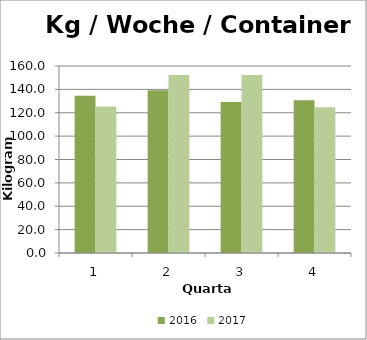
| Category | 2016 | 2017 |
|---|---|---|
| 0 | 134.615 | 125.385 |
| 1 | 139.231 | 152.308 |
| 2 | 129.231 | 152.308 |
| 3 | 130.769 | 124.615 |